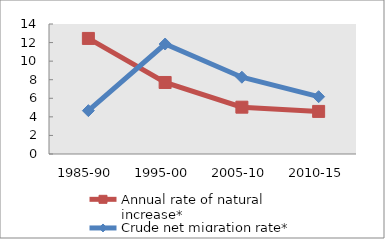
| Category | Annual rate of natural increase* | Crude net migration rate* |
|---|---|---|
| 1985-90 | 12.446 | 4.67 |
| 1995-00 | 7.703 | 11.844 |
| 2005-10 | 5.043 | 8.27 |
| 2010-15 | 4.586 | 6.172 |